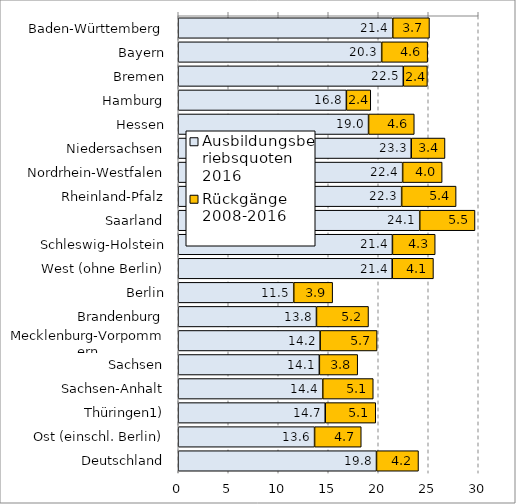
| Category | Ausbildungsbetriebsquoten 2016 | Rückgänge 
2008-2016 |
|---|---|---|
| Baden-Württemberg | 21.449 | 3.672 |
| Bayern | 20.343 | 4.596 |
| Bremen | 22.506 | 2.408 |
| Hamburg | 16.813 | 2.44 |
| Hessen | 19.031 | 4.571 |
| Niedersachsen | 23.298 | 3.377 |
| Nordrhein-Westfalen | 22.438 | 3.952 |
| Rheinland-Pfalz | 22.34 | 5.444 |
| Saarland | 24.148 | 5.526 |
| Schleswig-Holstein | 21.417 | 4.278 |
| West (ohne Berlin) | 21.398 | 4.121 |
| Berlin | 11.547 | 3.893 |
| Brandenburg | 13.821 | 5.205 |
| Mecklenburg-Vorpommern | 14.188 | 5.694 |
| Sachsen | 14.111 | 3.834 |
| Sachsen-Anhalt | 14.449 | 5.052 |
| Thüringen1) | 14.697 | 5.052 |
| Ost (einschl. Berlin) | 13.631 | 4.669 |
| Deutschland | 19.825 | 4.199 |